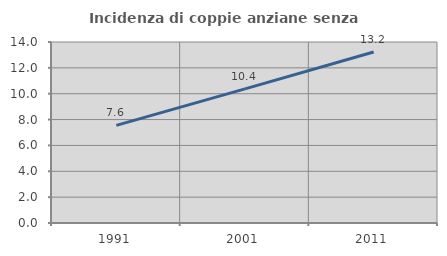
| Category | Incidenza di coppie anziane senza figli  |
|---|---|
| 1991.0 | 7.554 |
| 2001.0 | 10.378 |
| 2011.0 | 13.223 |